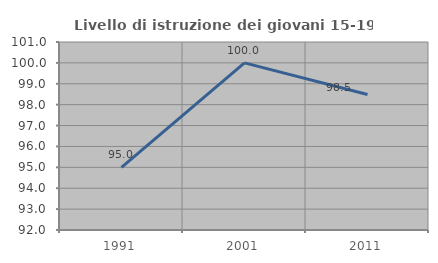
| Category | Livello di istruzione dei giovani 15-19 anni |
|---|---|
| 1991.0 | 95 |
| 2001.0 | 100 |
| 2011.0 | 98.485 |